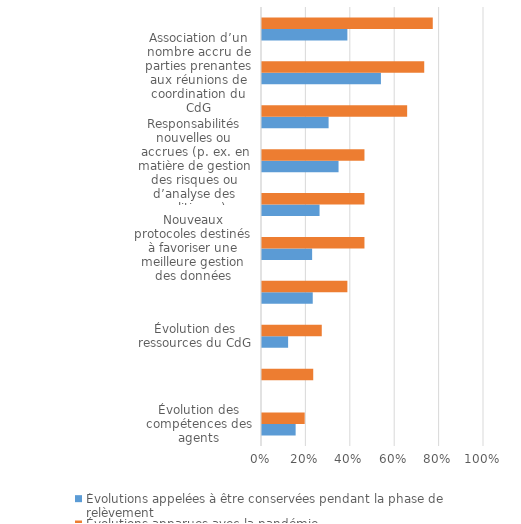
| Category | Évolutions appelées à être conservées pendant la phase de relèvement | Évolutions apparues avec la pandémie |
|---|---|---|
| Évolution des compétences des agents | 0.152 | 0.192 |
| Évolution du nombre d’agents | 0 | 0.231 |
| Évolution des ressources du CdG | 0.118 | 0.269 |
| Évolution du nombre de thématiques relevant de la responsabilité du CdG | 0.229 | 0.385 |
| Nouveaux protocoles destinés à favoriser une meilleure gestion des données | 0.226 | 0.462 |
| Service ou coordinateur spécial au sein du CdG chargé de la coordination face au COVID-19 | 0.259 | 0.462 |
| Responsabilités nouvelles ou accrues (p. ex. en matière de gestion des risques ou d’analyse des politiques) | 0.345 | 0.462 |
| Nouveaux protocoles/lignes directrices sur la communication et la lutte contre la mésinformation/désinformation | 0.3 | 0.654 |
| Association d’un nombre accru de parties prenantes aux réunions de coordination du CdG | 0.536 | 0.731 |
| Augmentation du nombre d’instances de coordination interministérielle bénéficiant du soutien du CdG | 0.385 | 0.769 |